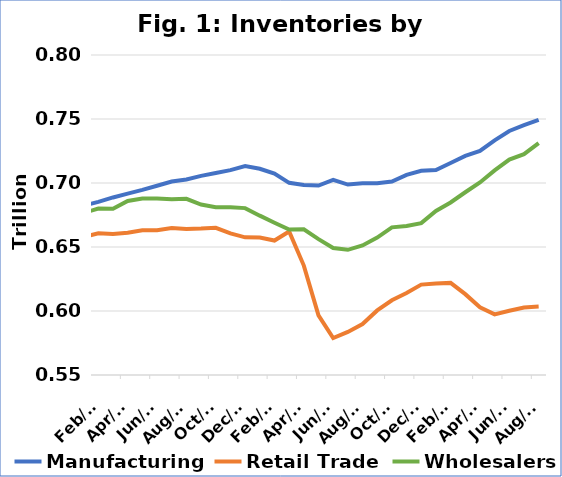
| Category | Manufacturing | Retail Trade | Wholesalers |
|---|---|---|---|
| 2019-01-01 | 0.682 | 0.658 | 0.677 |
| 2019-02-01 | 0.685 | 0.661 | 0.68 |
| 2019-03-01 | 0.689 | 0.66 | 0.68 |
| 2019-04-01 | 0.692 | 0.661 | 0.686 |
| 2019-05-01 | 0.695 | 0.663 | 0.688 |
| 2019-06-01 | 0.698 | 0.663 | 0.688 |
| 2019-07-01 | 0.701 | 0.665 | 0.687 |
| 2019-08-01 | 0.703 | 0.664 | 0.688 |
| 2019-09-01 | 0.706 | 0.664 | 0.683 |
| 2019-10-01 | 0.708 | 0.665 | 0.681 |
| 2019-11-01 | 0.71 | 0.661 | 0.681 |
| 2019-12-01 | 0.713 | 0.658 | 0.68 |
| 2020-01-01 | 0.711 | 0.657 | 0.674 |
| 2020-02-01 | 0.707 | 0.655 | 0.669 |
| 2020-03-01 | 0.7 | 0.662 | 0.664 |
| 2020-04-01 | 0.698 | 0.635 | 0.664 |
| 2020-05-01 | 0.698 | 0.597 | 0.656 |
| 2020-06-01 | 0.702 | 0.579 | 0.649 |
| 2020-07-01 | 0.699 | 0.584 | 0.648 |
| 2020-08-01 | 0.7 | 0.59 | 0.651 |
| 2020-09-01 | 0.7 | 0.6 | 0.657 |
| 2020-10-01 | 0.701 | 0.608 | 0.665 |
| 2020-11-01 | 0.706 | 0.614 | 0.666 |
| 2020-12-01 | 0.71 | 0.621 | 0.669 |
| 2021-01-01 | 0.71 | 0.622 | 0.678 |
| 2021-02-01 | 0.716 | 0.622 | 0.685 |
| 2021-03-01 | 0.721 | 0.613 | 0.693 |
| 2021-04-01 | 0.725 | 0.603 | 0.7 |
| 2021-05-01 | 0.733 | 0.597 | 0.71 |
| 2021-06-01 | 0.741 | 0.6 | 0.718 |
| 2021-07-01 | 0.745 | 0.603 | 0.723 |
| 2021-08-01 | 0.749 | 0.603 | 0.731 |